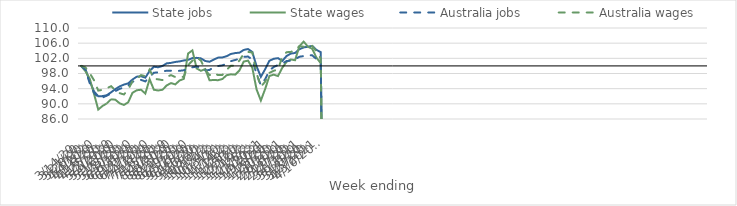
| Category | State jobs | State wages | Australia jobs | Australia wages |
|---|---|---|---|---|
| 14/03/2020 | 100 | 100 | 100 | 100 |
| 21/03/2020 | 99.174 | 98.595 | 98.969 | 99.607 |
| 28/03/2020 | 95.988 | 96.652 | 95.465 | 98.096 |
| 04/04/2020 | 93.281 | 92.665 | 92.926 | 96.24 |
| 11/04/2020 | 91.99 | 88.483 | 91.665 | 93.491 |
| 18/04/2020 | 92.037 | 89.446 | 91.648 | 93.698 |
| 25/04/2020 | 92.261 | 90.096 | 92.178 | 94.112 |
| 02/05/2020 | 93.046 | 91.208 | 92.676 | 94.658 |
| 09/05/2020 | 93.885 | 91.083 | 93.362 | 93.579 |
| 16/05/2020 | 94.592 | 90.138 | 93.954 | 92.815 |
| 23/05/2020 | 95.076 | 89.705 | 94.309 | 92.466 |
| 30/05/2020 | 95.401 | 90.408 | 94.816 | 93.79 |
| 06/06/2020 | 96.414 | 92.912 | 95.798 | 95.927 |
| 13/06/2020 | 97.164 | 93.578 | 96.298 | 96.601 |
| 20/06/2020 | 97.276 | 93.72 | 96.313 | 97.572 |
| 27/06/2020 | 96.906 | 92.718 | 95.913 | 97.302 |
| 04/07/2020 | 98.678 | 96.495 | 97.122 | 99.043 |
| 11/07/2020 | 99.771 | 93.712 | 98.196 | 96.625 |
| 18/07/2020 | 99.646 | 93.525 | 98.298 | 96.459 |
| 25/07/2020 | 99.987 | 93.71 | 98.521 | 96.266 |
| 01/08/2020 | 100.671 | 94.853 | 98.741 | 97.104 |
| 08/08/2020 | 100.802 | 95.477 | 98.74 | 97.565 |
| 15/08/2020 | 101.042 | 95.128 | 98.647 | 97.073 |
| 22/08/2020 | 101.191 | 96.15 | 98.71 | 96.935 |
| 29/08/2020 | 101.443 | 96.588 | 98.849 | 97.171 |
| 05/09/2020 | 101.605 | 103.276 | 99.156 | 100.217 |
| 12/09/2020 | 102.058 | 104.096 | 99.633 | 101.376 |
| 19/09/2020 | 102.127 | 99.334 | 99.824 | 102.277 |
| 26/09/2020 | 101.986 | 98.71 | 99.608 | 101.388 |
| 03/10/2020 | 101.3 | 99.17 | 98.809 | 99.006 |
| 10/10/2020 | 101.103 | 96.224 | 98.937 | 97.561 |
| 17/10/2020 | 101.677 | 96.28 | 99.695 | 98.146 |
| 24/10/2020 | 102.184 | 96.238 | 99.968 | 97.574 |
| 31/10/2020 | 102.228 | 96.541 | 100.149 | 97.618 |
| 07/11/2020 | 102.571 | 97.54 | 100.524 | 99.008 |
| 14/11/2020 | 103.153 | 97.782 | 101.259 | 100.027 |
| 21/11/2020 | 103.386 | 97.694 | 101.568 | 100.07 |
| 28/11/2020 | 103.493 | 98.807 | 101.862 | 101.42 |
| 05/12/2020 | 104.212 | 101.15 | 102.408 | 103.225 |
| 12/12/2020 | 104.457 | 101.398 | 102.467 | 103.683 |
| 19/12/2020 | 103.678 | 99.523 | 101.656 | 103.548 |
| 26/12/2020 | 99.92 | 93.803 | 97.85 | 98.062 |
| 02/01/2021 | 97.121 | 90.864 | 94.918 | 94.494 |
| 09/01/2021 | 99.12 | 93.898 | 96.496 | 95.843 |
| 16/01/2021 | 101.357 | 97.348 | 98.804 | 98.169 |
| 23/01/2021 | 101.872 | 97.7 | 99.699 | 98.726 |
| 30/01/2021 | 102.052 | 97.321 | 100.239 | 99.021 |
| 06/02/2021 | 101.302 | 99.482 | 100.616 | 102.406 |
| 13/02/2021 | 102.604 | 101.086 | 101.287 | 103.616 |
| 20/02/2021 | 103.253 | 101.688 | 101.379 | 103.698 |
| 27/02/2021 | 103.414 | 101.511 | 101.729 | 104.114 |
| 06/03/2021 | 104.397 | 105.177 | 102.416 | 105.202 |
| 13/03/2021 | 104.875 | 106.409 | 102.596 | 105.075 |
| 20/03/2021 | 105.07 | 105.077 | 102.84 | 105.243 |
| 27/03/2021 | 105.284 | 104.518 | 102.789 | 105.282 |
| 03/04/2021 | 104.22 | 102.165 | 101.804 | 103.78 |
| 10/04/2021 | 103.644 | 100.727 | 100.982 | 101.976 |